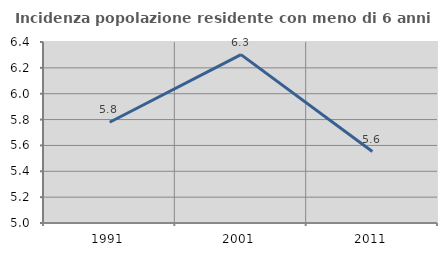
| Category | Incidenza popolazione residente con meno di 6 anni |
|---|---|
| 1991.0 | 5.78 |
| 2001.0 | 6.302 |
| 2011.0 | 5.553 |